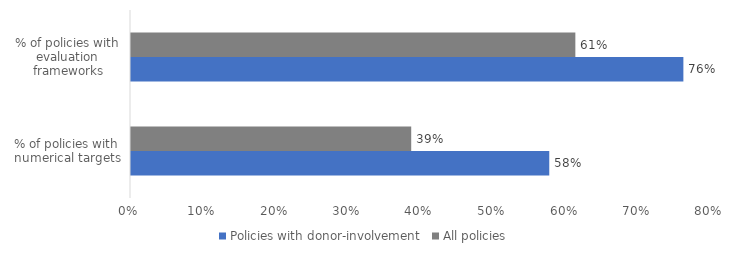
| Category | Policies with donor-involvement | All policies |
|---|---|---|
| % of policies with numerical targets | 0.577 | 0.387 |
| % of policies with evaluation frameworks | 0.762 | 0.613 |